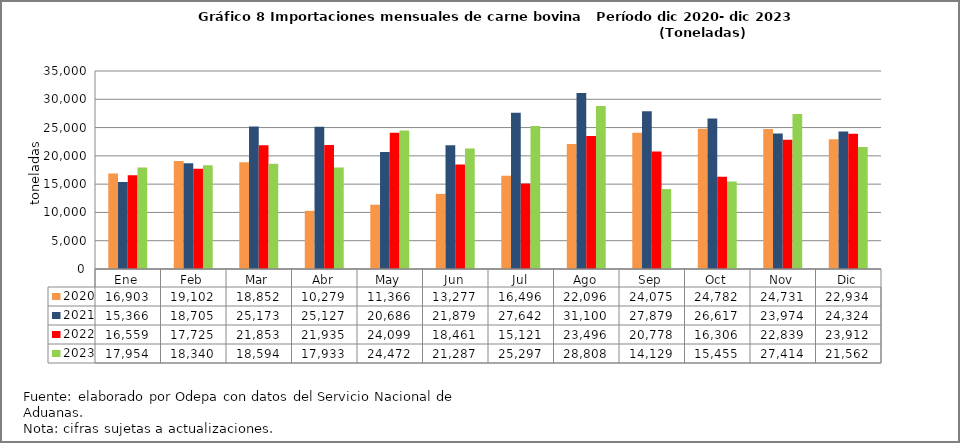
| Category | 2020 | 2021 | 2022 | 2023 |
|---|---|---|---|---|
| Ene | 16902.685 | 15366 | 16559 | 17953.936 |
| Feb | 19102.369 | 18705 | 17725 | 18339.58 |
| Mar | 18851.512 | 25173 | 21853 | 18593.578 |
| Abr | 10279.398 | 25127 | 21935 | 17932.874 |
| May | 11366.342 | 20686 | 24099 | 24472.262 |
| Jun | 13277.494 | 21879 | 18461 | 21286.618 |
| Jul | 16495.696 | 27642 | 15121 | 25296.807 |
| Ago | 22095.702 | 31100 | 23496 | 28807.979 |
| Sep | 24074.757 | 27879 | 20778 | 14128.608 |
| Oct | 24782.271 | 26617 | 16306 | 15455.073 |
| Nov | 24731.18 | 23974 | 22839 | 27414.272 |
| Dic | 22934 | 24324 | 23912 | 21561.725 |